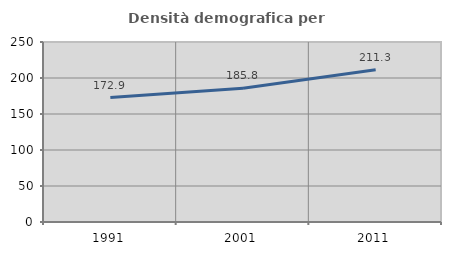
| Category | Densità demografica |
|---|---|
| 1991.0 | 172.863 |
| 2001.0 | 185.833 |
| 2011.0 | 211.348 |